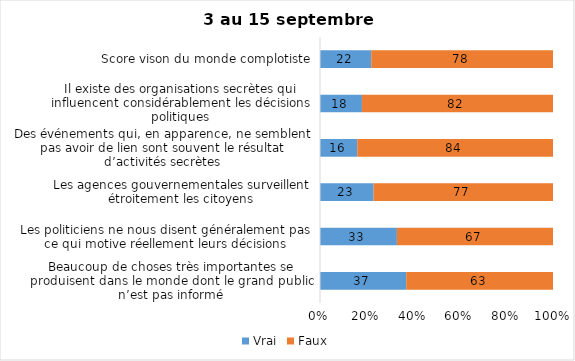
| Category | Vrai | Faux |
|---|---|---|
| Beaucoup de choses très importantes se produisent dans le monde dont le grand public n’est pas informé | 37 | 63 |
| Les politiciens ne nous disent généralement pas ce qui motive réellement leurs décisions | 33 | 67 |
| Les agences gouvernementales surveillent étroitement les citoyens | 23 | 77 |
| Des événements qui, en apparence, ne semblent pas avoir de lien sont souvent le résultat d’activités secrètes | 16 | 84 |
| Il existe des organisations secrètes qui influencent considérablement les décisions politiques | 18 | 82 |
| Score vison du monde complotiste | 22 | 78 |